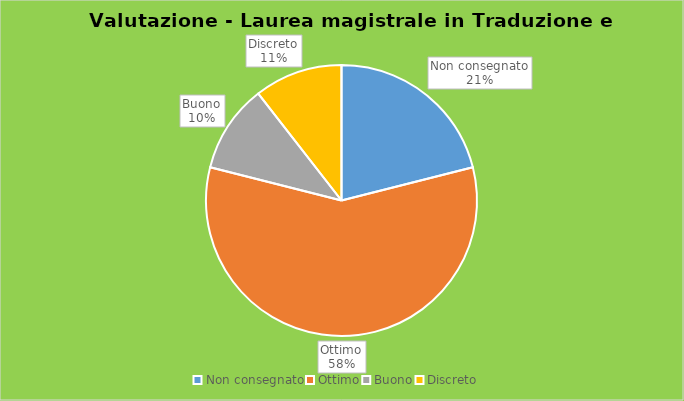
| Category | Series 0 |
|---|---|
| Non consegnato | 4 |
| Ottimo | 11 |
| Buono | 2 |
| Discreto | 2 |